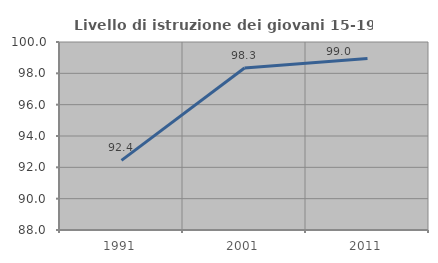
| Category | Livello di istruzione dei giovani 15-19 anni |
|---|---|
| 1991.0 | 92.444 |
| 2001.0 | 98.337 |
| 2011.0 | 98.95 |